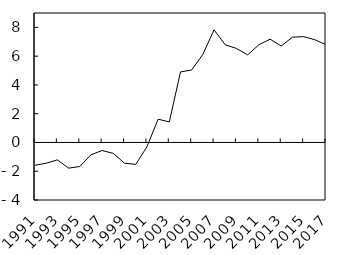
| Category | Balance courante de l'Allemagne (% du PIB) |
|---|---|
| 1991.0 | -1.586 |
| 1992.0 | -1.443 |
| 1993.0 | -1.212 |
| 1994.0 | -1.783 |
| 1995.0 | -1.672 |
| 1996.0 | -0.855 |
| 1997.0 | -0.558 |
| 1998.0 | -0.764 |
| 1999.0 | -1.442 |
| 2000.0 | -1.525 |
| 2001.0 | -0.305 |
| 2002.0 | 1.619 |
| 2003.0 | 1.427 |
| 2004.0 | 4.901 |
| 2005.0 | 5.041 |
| 2006.0 | 6.126 |
| 2007.0 | 7.829 |
| 2008.0 | 6.787 |
| 2009.0 | 6.537 |
| 2010.0 | 6.088 |
| 2011.0 | 6.79 |
| 2012.0 | 7.18 |
| 2013.0 | 6.706 |
| 2014.0 | 7.316 |
| 2015.0 | 7.357 |
| 2016.0 | 7.142 |
| 2017.0 | 6.794 |